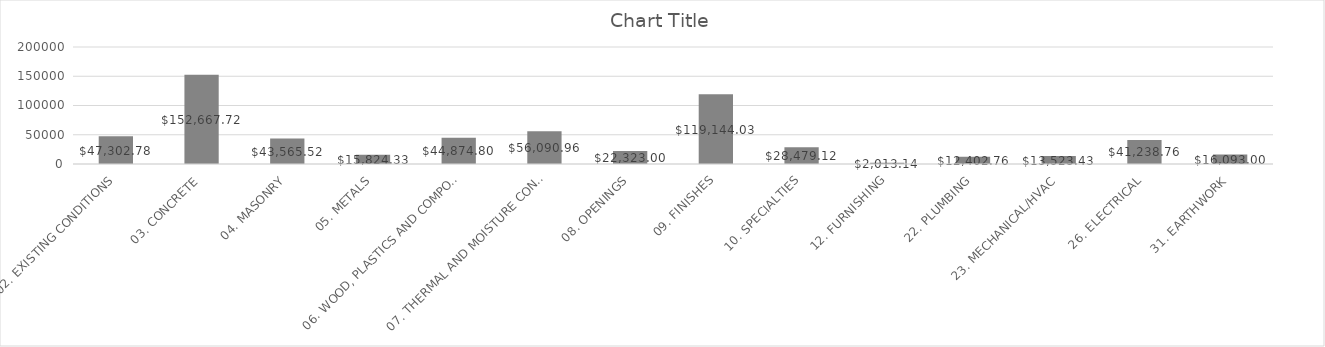
| Category | Series 0 | Series 1 | Series 2 | Series 3 | Series 4 | Series 5 | Series 6 | Series 7 | Series 8 | Series 9 | Series 10 |
|---|---|---|---|---|---|---|---|---|---|---|---|
| 02. EXISTING CONDITIONS |  |  |  |  |  |  |  |  |  |  | 47302.776 |
| 03. CONCRETE |  |  |  |  |  |  |  |  |  |  | 152667.716 |
| 04. MASONRY |  |  |  |  |  |  |  |  |  |  | 43565.522 |
| 05. METALS |  |  |  |  |  |  |  |  |  |  | 15824.325 |
| 06. WOOD, PLASTICS AND COMPOSITES |  |  |  |  |  |  |  |  |  |  | 44874.8 |
| 07. THERMAL AND MOISTURE CONDITIONS |  |  |  |  |  |  |  |  |  |  | 56090.96 |
| 08. OPENINGS |  |  |  |  |  |  |  |  |  |  | 22323 |
| 09. FINISHES |  |  |  |  |  |  |  |  |  |  | 119144.032 |
| 10. SPECIALTIES |  |  |  |  |  |  |  |  |  |  | 28479.124 |
| 12. FURNISHING |  |  |  |  |  |  |  |  |  |  | 2013.14 |
| 22. PLUMBING |  |  |  |  |  |  |  |  |  |  | 12402.76 |
| 23. MECHANICAL/HVAC |  |  |  |  |  |  |  |  |  |  | 13523.43 |
| 26. ELECTRICAL |  |  |  |  |  |  |  |  |  |  | 41238.76 |
| 31. EARTHWORK |  |  |  |  |  |  |  |  |  |  | 16093 |